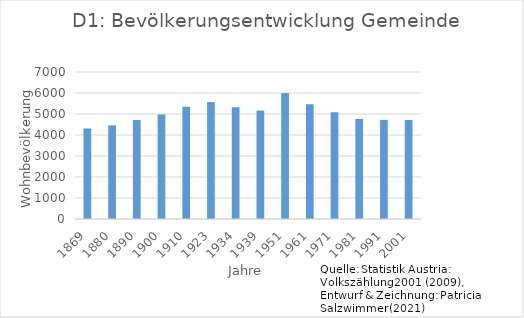
| Category | Bevölkerungsdaten  |
|---|---|
| 1869.0 | 4313 |
| 1880.0 | 4459 |
| 1890.0 | 4713 |
| 1900.0 | 4971 |
| 1910.0 | 5341 |
| 1923.0 | 5568 |
| 1934.0 | 5325 |
| 1939.0 | 5170 |
| 1951.0 | 5993 |
| 1961.0 | 5461 |
| 1971.0 | 5087 |
| 1981.0 | 4765 |
| 1991.0 | 4721 |
| 2001.0 | 4716 |